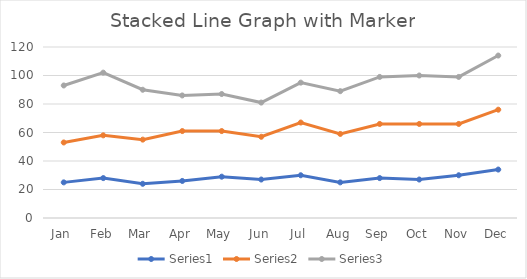
| Category | Series 0 | Series 1 | Series 2 |
|---|---|---|---|
| Jan | 25 | 28 | 40 |
| Feb | 28 | 30 | 44 |
| Mar | 24 | 31 | 35 |
| Apr | 26 | 35 | 25 |
| May | 29 | 32 | 26 |
| Jun | 27 | 30 | 24 |
| Jul | 30 | 37 | 28 |
| Aug | 25 | 34 | 30 |
| Sep | 28 | 38 | 33 |
| Oct | 27 | 39 | 34 |
| Nov | 30 | 36 | 33 |
| Dec | 34 | 42 | 38 |